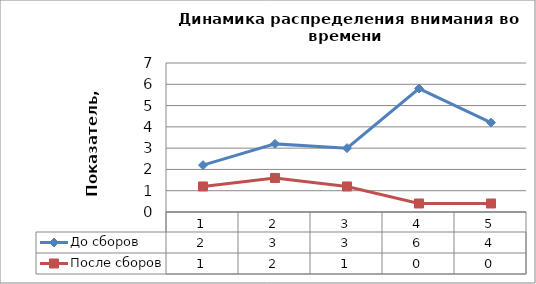
| Category | До сборов | После сборов |
|---|---|---|
| 0 | 2.2 | 1.2 |
| 1 | 3.2 | 1.6 |
| 2 | 3 | 1.2 |
| 3 | 5.8 | 0.4 |
| 4 | 4.2 | 0.4 |